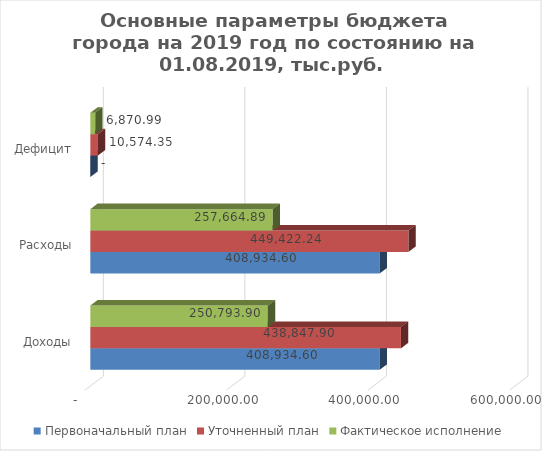
| Category | Первоначальный план | Уточненный план | Фактическое исполнение |
|---|---|---|---|
| Доходы | 408934.598 | 438847.896 | 250793.905 |
| Расходы | 408934.598 | 449422.244 | 257664.891 |
| Дефицит | 0 | 10574.348 | 6870.987 |